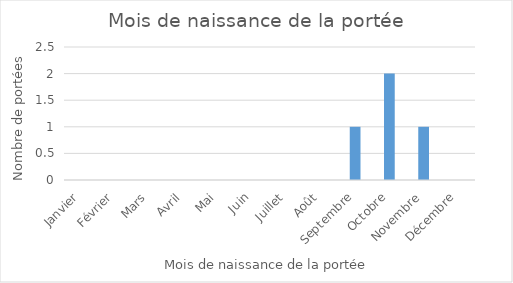
| Category | Series 0 |
|---|---|
| Janvier | 0 |
| Février | 0 |
| Mars | 0 |
| Avril | 0 |
| Mai | 0 |
| Juin | 0 |
| Juillet | 0 |
| Août | 0 |
| Septembre | 1 |
| Octobre | 2 |
| Novembre | 1 |
| Décembre | 0 |